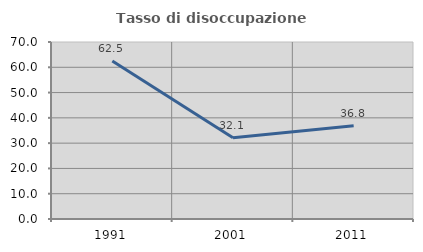
| Category | Tasso di disoccupazione giovanile  |
|---|---|
| 1991.0 | 62.5 |
| 2001.0 | 32.143 |
| 2011.0 | 36.842 |